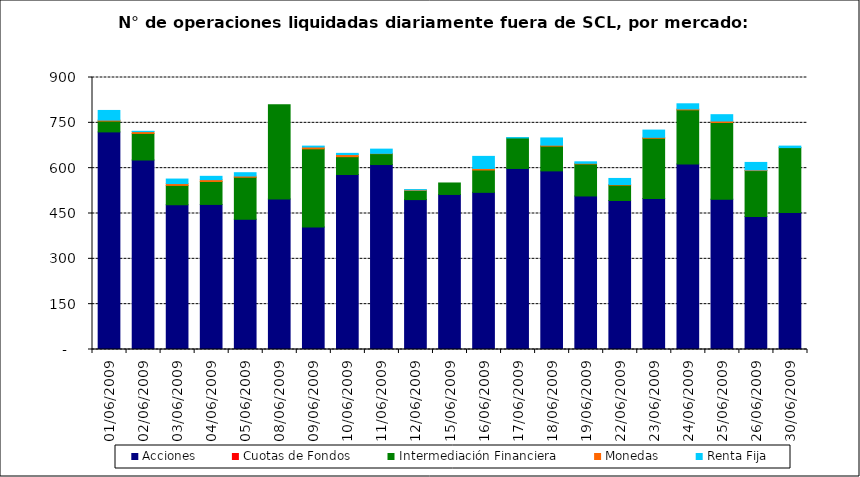
| Category | Acciones | Cuotas de Fondos | Intermediación Financiera | Monedas | Renta Fija |
|---|---|---|---|---|---|
| 01/06/2009 | 720 | 0 | 36 | 3 | 32 |
| 02/06/2009 | 627 | 0 | 88 | 6 | 1 |
| 03/06/2009 | 479 | 0 | 64 | 6 | 15 |
| 04/06/2009 | 480 | 0 | 76 | 6 | 11 |
| 05/06/2009 | 431 | 0 | 139 | 4 | 11 |
| 08/06/2009 | 498 | 0 | 312 | 0 | 0 |
| 09/06/2009 | 405 | 0 | 259 | 6 | 3 |
| 10/06/2009 | 579 | 0 | 59 | 7 | 4 |
| 11/06/2009 | 612 | 0 | 36 | 1 | 14 |
| 12/06/2009 | 496 | 0 | 30 | 2 | 1 |
| 15/06/2009 | 513 | 0 | 38 | 0 | 0 |
| 16/06/2009 | 520 | 0 | 74 | 5 | 40 |
| 17/06/2009 | 599 | 0 | 101 | 0 | 1 |
| 18/06/2009 | 591 | 0 | 82 | 3 | 24 |
| 19/06/2009 | 508 | 0 | 106 | 2 | 5 |
| 22/06/2009 | 493 | 0 | 51 | 2 | 20 |
| 23/06/2009 | 500 | 0 | 199 | 3 | 24 |
| 24/06/2009 | 614 | 0 | 179 | 3 | 17 |
| 25/06/2009 | 497 | 0 | 254 | 5 | 21 |
| 26/06/2009 | 440 | 0 | 152 | 2 | 25 |
| 30/06/2009 | 453 | 0 | 215 | 0 | 5 |